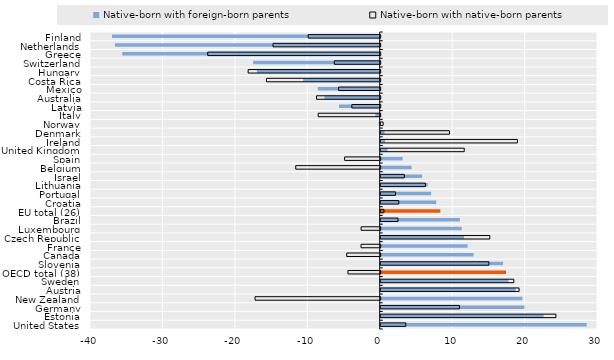
| Category | Native-born with foreign-born parents | Native-born with native-born parents |
|---|---|---|
| Finland | -36.955 | -9.951 |
| Netherlands | -36.559 | -14.803 |
| Greece | -35.547 | -23.816 |
| Switzerland | -17.472 | -6.342 |
| Hungary | -16.952 | -18.233 |
| Costa Rica | -10.567 | -15.706 |
| Mexico | -8.555 | -5.748 |
| Australia | -7.647 | -8.794 |
| Latvia | -5.625 | -3.919 |
| Italy | -0.594 | -8.563 |
| Norway | -0.142 | 0.332 |
| Denmark | 0.514 | 9.495 |
| Ireland | 0.617 | 18.867 |
| United Kingdom | 0.933 | 11.533 |
| Spain | 3.02 | -4.914 |
| Belgium | 4.27 | -11.664 |
| Israel | 5.707 | 3.262 |
| Lithuania | 6.497 | 6.163 |
| Portugal | 6.965 | 2.043 |
| Croatia | 7.659 | 2.492 |
| EU total (26) | 8.233 | 0.441 |
| Brazil | 10.931 | 2.39 |
| Luxembourg | 11.185 | -2.64 |
| Czech Republic | 11.503 | 15.062 |
| France | 11.995 | -2.648 |
| Canada | 12.822 | -4.623 |
| Slovenia | 16.89 | 14.932 |
| OECD total (38) | 17.305 | -4.455 |
| Sweden | 17.622 | 18.374 |
| Austria | 18.626 | 19.107 |
| New Zealand | 19.563 | -17.283 |
| Germany | 19.855 | 10.882 |
| Estonia | 22.499 | 24.19 |
| United States | 28.438 | 3.465 |